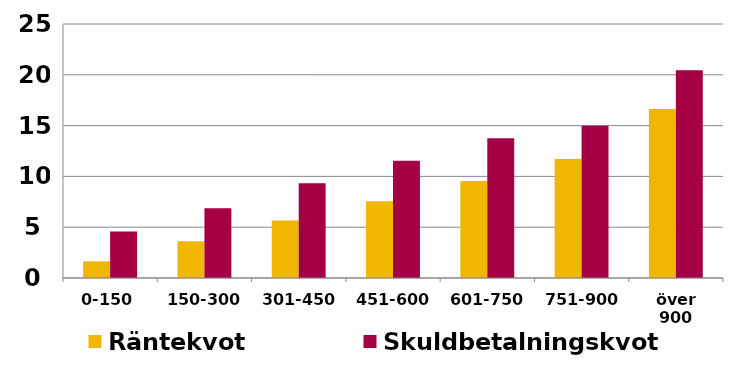
| Category | Räntekvot | Skuldbetalningskvot |
|---|---|---|
| 0-150 | 1.638 | 4.571 |
| 150-300 | 3.614 | 6.866 |
| 301-450 | 5.67 | 9.33 |
| 451-600 | 7.563 | 11.55 |
| 601-750 | 9.54 | 13.746 |
| 751-900 | 11.721 | 14.991 |
| över 900 | 16.638 | 20.437 |